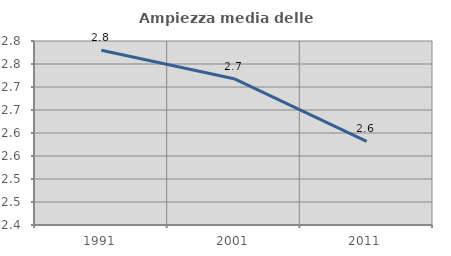
| Category | Ampiezza media delle famiglie |
|---|---|
| 1991.0 | 2.78 |
| 2001.0 | 2.718 |
| 2011.0 | 2.582 |